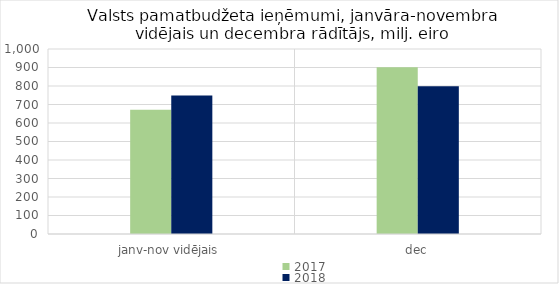
| Category | 2017 | 2018 |
|---|---|---|
| janv-nov vidējais | 671905.081 | 749216.596 |
| dec | 900960.999 | 799044.443 |